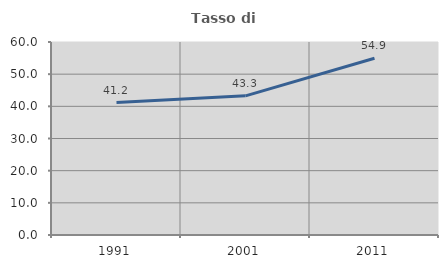
| Category | Tasso di occupazione   |
|---|---|
| 1991.0 | 41.159 |
| 2001.0 | 43.269 |
| 2011.0 | 54.93 |